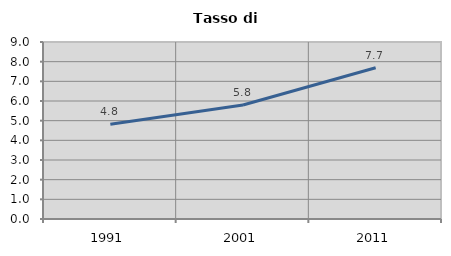
| Category | Tasso di disoccupazione   |
|---|---|
| 1991.0 | 4.816 |
| 2001.0 | 5.793 |
| 2011.0 | 7.692 |